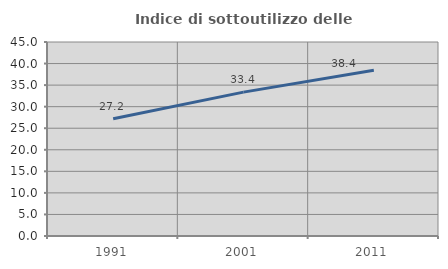
| Category | Indice di sottoutilizzo delle abitazioni  |
|---|---|
| 1991.0 | 27.207 |
| 2001.0 | 33.374 |
| 2011.0 | 38.441 |